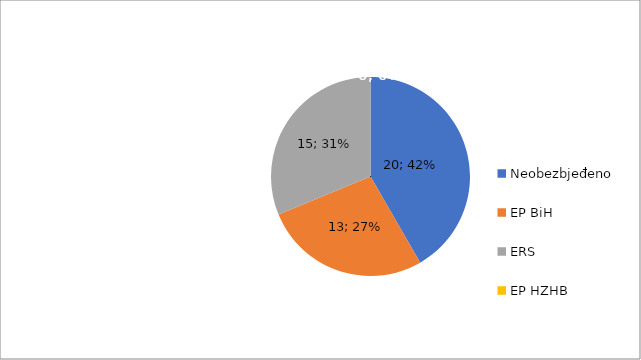
| Category | SR Vršno |
|---|---|
| Neobezbjeđeno | 20 |
| EP BiH | 13 |
| ERS | 15 |
| EP HZHB | 0 |